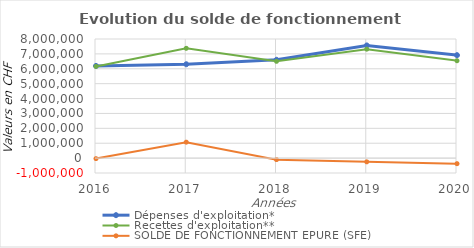
| Category | Dépenses d'exploitation* | Recettes d'exploitation** | SOLDE DE FONCTIONNEMENT EPURE (SFE) |
|---|---|---|---|
| 2016.0 | 6190957.02 | 6157833.92 | -33123.1 |
| 2017.0 | 6303974.68 | 7374991.5 | 1071016.82 |
| 2018.0 | 6604035.17 | 6501113.07 | -102922.1 |
| 2019.0 | 7567758.99 | 7317219.53 | -250539.46 |
| 2020.0 | 6914254 | 6539724 | -374530 |